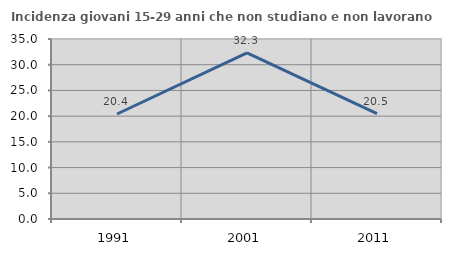
| Category | Incidenza giovani 15-29 anni che non studiano e non lavorano  |
|---|---|
| 1991.0 | 20.417 |
| 2001.0 | 32.314 |
| 2011.0 | 20.482 |